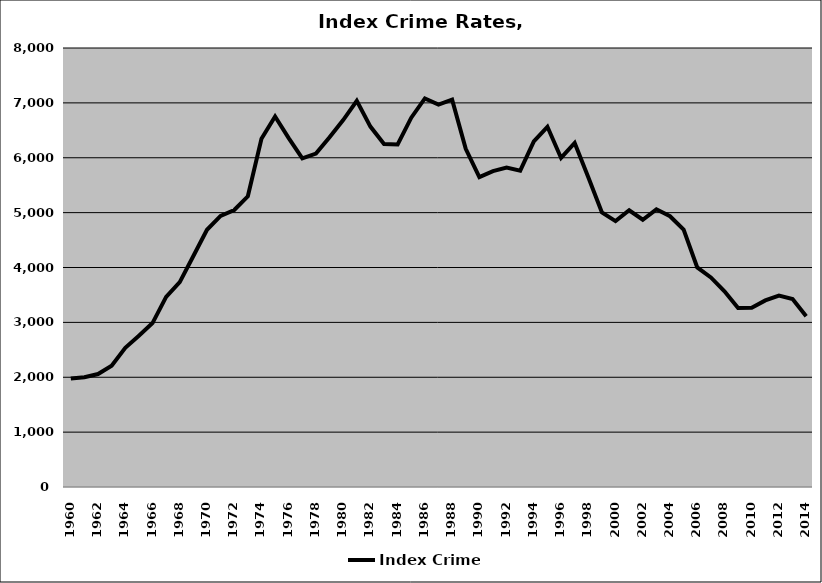
| Category | Index Crime |
|---|---|
| 1960.0 | 1977.173 |
| 1961.0 | 2001.112 |
| 1962.0 | 2058.155 |
| 1963.0 | 2210.405 |
| 1964.0 | 2535.436 |
| 1965.0 | 2758.083 |
| 1966.0 | 2987.212 |
| 1967.0 | 3465.133 |
| 1968.0 | 3733.964 |
| 1969.0 | 4209.793 |
| 1970.0 | 4688.185 |
| 1971.0 | 4939.805 |
| 1972.0 | 5048.396 |
| 1973.0 | 5297.079 |
| 1974.0 | 6344.748 |
| 1975.0 | 6752.229 |
| 1976.0 | 6358.824 |
| 1977.0 | 5987.205 |
| 1978.0 | 6075.409 |
| 1979.0 | 6372.972 |
| 1980.0 | 6686.939 |
| 1981.0 | 7036.91 |
| 1982.0 | 6567.497 |
| 1983.0 | 6250.864 |
| 1984.0 | 6243.68 |
| 1985.0 | 6729.81 |
| 1986.0 | 7080.689 |
| 1987.0 | 6968.979 |
| 1988.0 | 7058.701 |
| 1989.0 | 6161.135 |
| 1990.0 | 5646.02 |
| 1991.0 | 5755.133 |
| 1992.0 | 5820.927 |
| 1993.0 | 5765.567 |
| 1994.0 | 6296.403 |
| 1995.0 | 6563.929 |
| 1996.0 | 5996.629 |
| 1997.0 | 6269.75 |
| 1998.0 | 5646.648 |
| 1999.0 | 5001.758 |
| 2000.0 | 4845.386 |
| 2001.0 | 5043.241 |
| 2002.0 | 4870.049 |
| 2003.0 | 5060.39 |
| 2004.0 | 4934.032 |
| 2005.0 | 4689.449 |
| 2006.0 | 4002.126 |
| 2007.0 | 3818.752 |
| 2008.0 | 3565.565 |
| 2009.0 | 3260.826 |
| 2010.0 | 3264.959 |
| 2011.0 | 3399.799 |
| 2012.0 | 3488.768 |
| 2013.0 | 3427.105 |
| 2014.0 | 3111.374 |